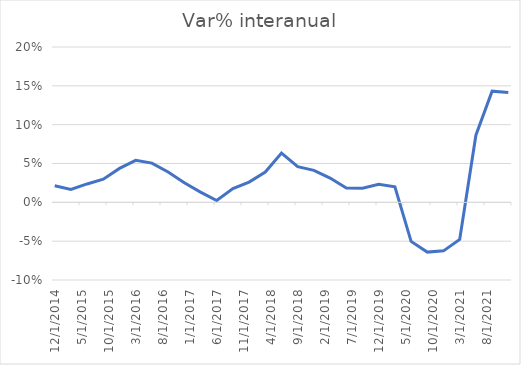
| Category | Series 0 |
|---|---|
| 12/20/14 | 0.021 |
| 3/20/15 | 0.017 |
| 6/18/15 | 0.024 |
| 9/16/15 | 0.03 |
| 12/15/15 | 0.044 |
| 3/14/16 | 0.054 |
| 6/12/16 | 0.051 |
| 9/10/16 | 0.039 |
| 12/9/16 | 0.025 |
| 3/9/17 | 0.013 |
| 6/7/17 | 0.002 |
| 9/5/17 | 0.018 |
| 12/4/17 | 0.026 |
| 3/30/18 | 0.039 |
| 6/28/18 | 0.063 |
| 9/26/18 | 0.046 |
| 12/25/18 | 0.041 |
| 3/25/19 | 0.031 |
| 6/23/19 | 0.018 |
| 9/21/19 | 0.018 |
| 12/20/19 | 0.023 |
| 3/19/20 | 0.02 |
| 6/17/20 | -0.05 |
| 9/15/20 | -0.064 |
| 12/14/20 | -0.062 |
| 3/14/21 | -0.048 |
| 6/12/21 | 0.086 |
| 9/10/21 | 0.143 |
| 12/9/21 | 0.141 |